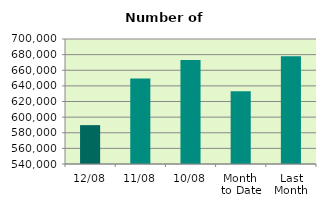
| Category | Series 0 |
|---|---|
| 12/08 | 589758 |
| 11/08 | 649372 |
| 10/08 | 673216 |
| Month 
to Date | 633227.8 |
| Last
Month | 677996.667 |